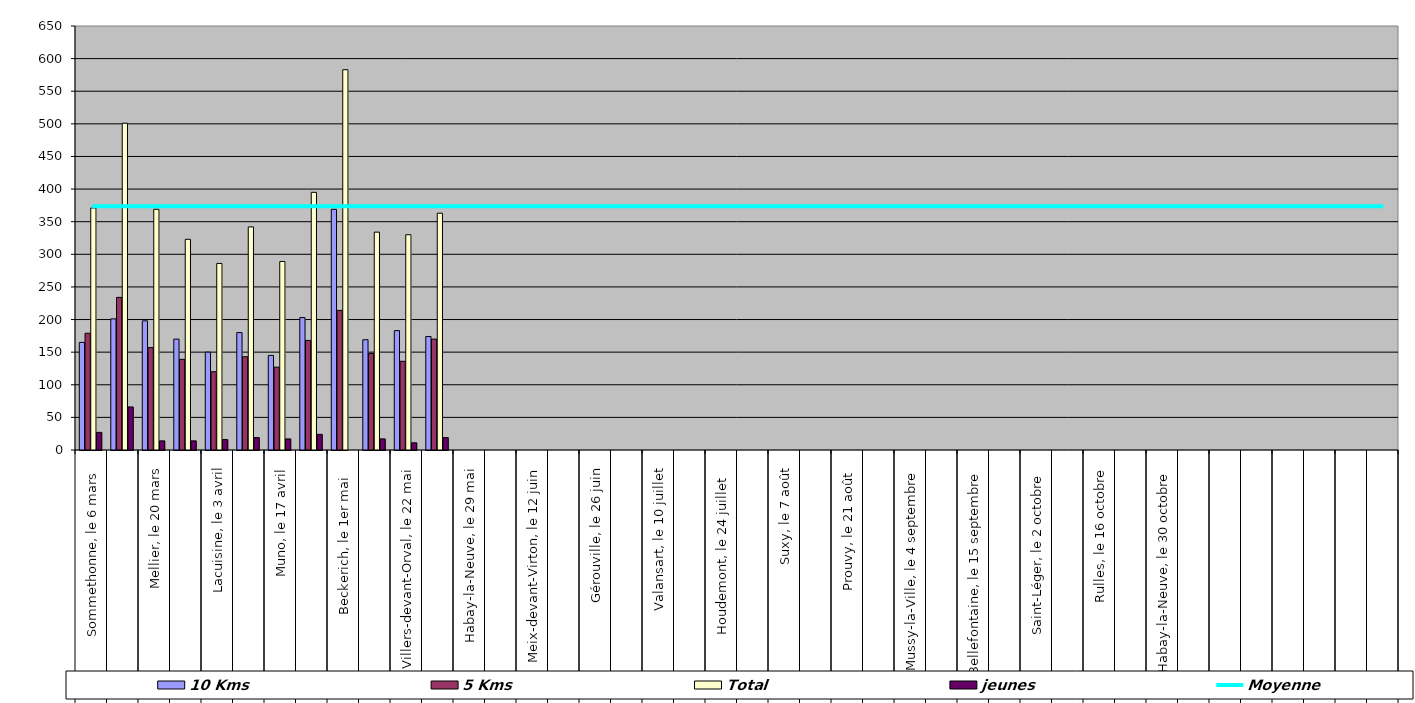
| Category | 10 Kms | 5 Kms | Total | jeunes |
|---|---|---|---|---|
| 0 | 165 | 179 | 371 | 27 |
| 1 | 201 | 234 | 501 | 66 |
| 2 | 198 | 157 | 369 | 14 |
| 3 | 170 | 139 | 323 | 14 |
| 4 | 150 | 120 | 286 | 16 |
| 5 | 180 | 143 | 342 | 19 |
| 6 | 145 | 127 | 289 | 17 |
| 7 | 203 | 168 | 395 | 24 |
| 8 | 369 | 214 | 583 | 0 |
| 9 | 169 | 148 | 334 | 17 |
| 10 | 183 | 136 | 330 | 11 |
| 11 | 174 | 170 | 363 | 19 |
| 12 | 0 | 0 | 0 | 0 |
| 13 | 0 | 0 | 0 | 0 |
| 14 | 0 | 0 | 0 | 0 |
| 15 | 0 | 0 | 0 | 0 |
| 16 | 0 | 0 | 0 | 0 |
| 17 | 0 | 0 | 0 | 0 |
| 18 | 0 | 0 | 0 | 0 |
| 19 | 0 | 0 | 0 | 0 |
| 20 | 0 | 0 | 0 | 0 |
| 21 | 0 | 0 | 0 | 0 |
| 22 | 0 | 0 | 0 | 0 |
| 23 | 0 | 0 | 0 | 0 |
| 24 | 0 | 0 | 0 | 0 |
| 25 | 0 | 0 | 0 | 0 |
| 26 | 0 | 0 | 0 | 0 |
| 27 | 0 | 0 | 0 | 0 |
| 28 | 0 | 0 | 0 | 0 |
| 29 | 0 | 0 | 0 | 0 |
| 30 | 0 | 0 | 0 | 0 |
| 31 | 0 | 0 | 0 | 0 |
| 32 | 0 | 0 | 0 | 0 |
| 33 | 0 | 0 | 0 | 0 |
| 34 | 0 | 0 | 0 | 0 |
| 35 | 0 | 0 | 0 | 0 |
| 36 | 0 | 0 | 0 | 0 |
| 37 | 0 | 0 | 0 | 0 |
| 38 | 0 | 0 | 0 | 0 |
| 39 | 0 | 0 | 0 | 0 |
| 40 | 0 | 0 | 0 | 0 |
| 41 | 0 | 0 | 0 | 0 |